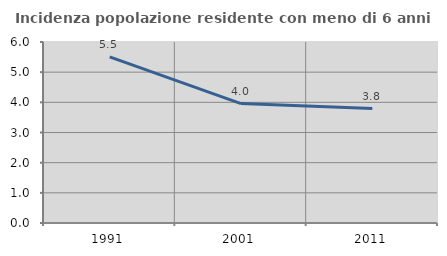
| Category | Incidenza popolazione residente con meno di 6 anni |
|---|---|
| 1991.0 | 5.508 |
| 2001.0 | 3.958 |
| 2011.0 | 3.793 |